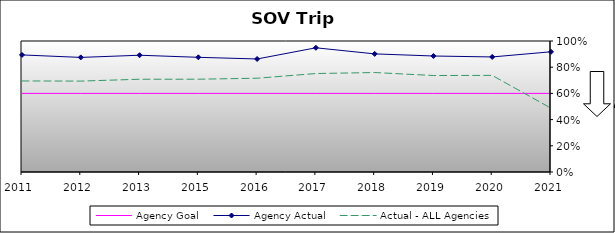
| Category | Agency Goal | Agency Actual | Actual - ALL Agencies |
|---|---|---|---|
| 2011.0 | 0.6 | 0.894 | 0.695 |
| 2012.0 | 0.6 | 0.875 | 0.694 |
| 2013.0 | 0.6 | 0.891 | 0.708 |
| 2015.0 | 0.6 | 0.875 | 0.708 |
| 2016.0 | 0.6 | 0.863 | 0.716 |
| 2017.0 | 0.6 | 0.948 | 0.752 |
| 2018.0 | 0.6 | 0.902 | 0.759 |
| 2019.0 | 0.6 | 0.885 | 0.736 |
| 2020.0 | 0.6 | 0.878 | 0.737 |
| 2021.0 | 0.6 | 0.918 | 0.487 |